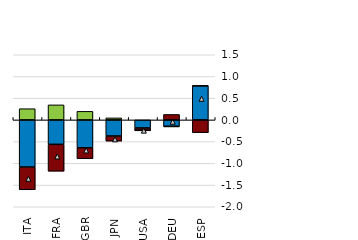
| Category | Énergie | Produits alimentaires | Autres (hors produits alimentaires et énergie) |
|---|---|---|---|
| ITA | -1.085 | -0.523 | 0.258 |
| FRA | -0.562 | -0.62 | 0.346 |
| GBR | -0.642 | -0.252 | 0.197 |
| JPN | -0.371 | -0.117 | 0.046 |
| USA | -0.186 | -0.055 | -0.001 |
| DEU | -0.145 | 0.126 | -0.017 |
| ESP | 0.784 | -0.293 | 0.001 |